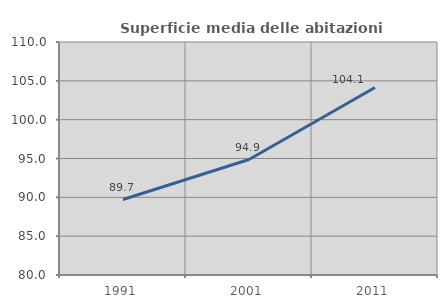
| Category | Superficie media delle abitazioni occupate |
|---|---|
| 1991.0 | 89.717 |
| 2001.0 | 94.868 |
| 2011.0 | 104.144 |